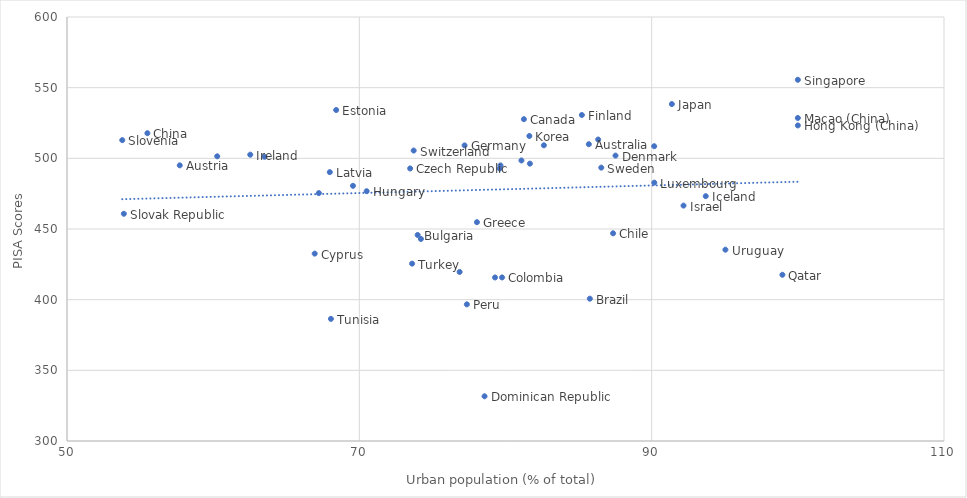
| Category | Series 0 |
|---|---|
| 85.701 | 509.994 |
| 57.715 | 495.037 |
| 85.77 | 400.682 |
| 73.99 | 445.772 |
| 81.259 | 527.705 |
| 87.36 | 446.956 |
| 55.5 | 517.779 |
| 79.764 | 415.729 |
| 76.862 | 419.608 |
| 66.946 | 432.577 |
| 73.477 | 492.83 |
| 87.526 | 501.937 |
| 78.566 | 331.639 |
| 68.416 | 534.194 |
| 85.225 | 530.661 |
| 79.655 | 494.978 |
| 77.2 | 509.141 |
| 78.046 | 454.829 |
| 100.0 | 523.277 |
| 70.5 | 476.748 |
| 93.7 | 473.23 |
| 62.538 | 502.575 |
| 92.179 | 466.553 |
| 69.565 | 480.547 |
| 91.381 | 538.395 |
| 81.634 | 515.81 |
| 67.98 | 490.225 |
| 67.23 | 475.409 |
| 90.179 | 482.806 |
| 100.0 | 528.55 |
| 74.213 | 442.948 |
| 79.285 | 415.71 |
| 90.173 | 508.575 |
| 86.341 | 513.304 |
| 81.091 | 498.481 |
| 77.357 | 396.684 |
| 60.278 | 501.435 |
| 63.514 | 501.1 |
| 98.945 | 417.611 |
| 100.0 | 555.575 |
| 53.889 | 460.775 |
| 53.781 | 512.864 |
| 79.602 | 492.786 |
| 86.553 | 493.422 |
| 73.718 | 505.506 |
| 68.056 | 386.403 |
| 73.611 | 425.49 |
| 82.626 | 509.222 |
| 81.671 | 496.242 |
| 95.045 | 435.363 |